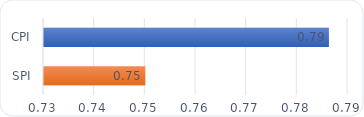
| Category | CPI-SPI |
|---|---|
| CPI | 0.786 |
| SPI | 0.75 |